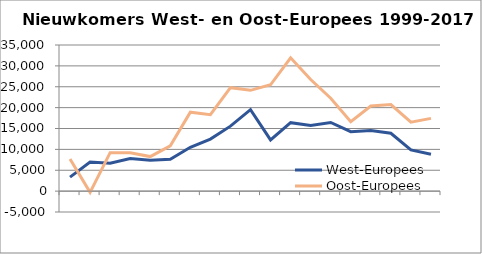
| Category | West-Europees | Oost-Europees |
|---|---|---|
| 0 | 3344 | 7685 |
| 1 | 6952 | -286 |
| 2 | 6661 | 9216 |
| 3 | 7816 | 9212 |
| 4 | 7382 | 8281 |
| 5 | 7608 | 10851 |
| 6 | 10502 | 18906 |
| 7 | 12460 | 18297 |
| 8 | 15562 | 24770 |
| 9 | 19511 | 24142 |
| 10 | 12261 | 25465 |
| 11 | 16393 | 31930 |
| 12 | 15721 | 26721 |
| 13 | 16447 | 22258 |
| 14 | 14248 | 16607 |
| 15 | 14508 | 20400 |
| 16 | 13867 | 20725 |
| 17 | 9876 | 16526 |
| 18 | 8839 | 17429.5 |